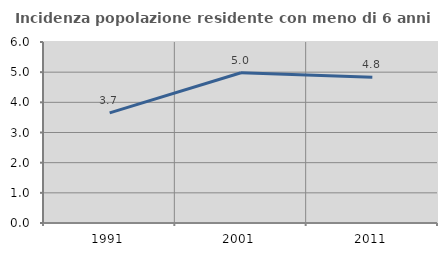
| Category | Incidenza popolazione residente con meno di 6 anni |
|---|---|
| 1991.0 | 3.652 |
| 2001.0 | 4.981 |
| 2011.0 | 4.829 |